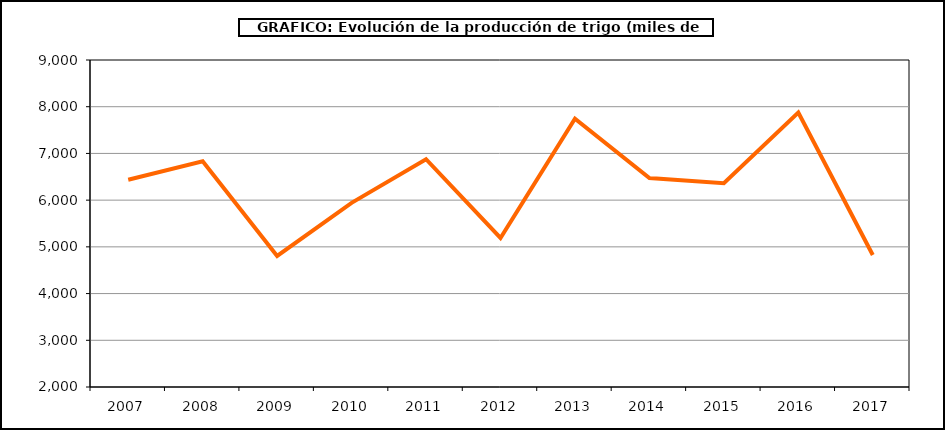
| Category | Producción |
|---|---|
| 2007.0 | 6436.359 |
| 2008.0 | 6831.461 |
| 2009.0 | 4804.772 |
| 2010.0 | 5941.197 |
| 2011.0 | 6876.651 |
| 2012.0 | 5189.828 |
| 2013.0 | 7744.928 |
| 2014.0 | 6472.734 |
| 2015.0 | 6362.692 |
| 2016.0 | 7873.135 |
| 2017.0 | 4825.109 |